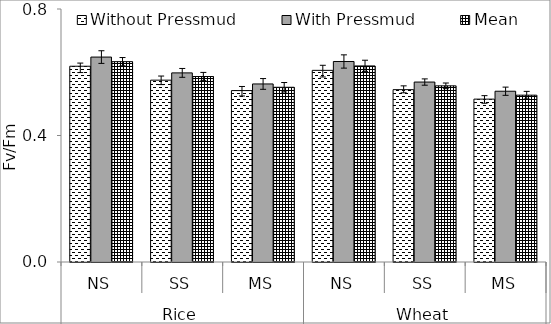
| Category | Without Pressmud | With Pressmud | Mean |
|---|---|---|---|
| 0 | 0.619 | 0.648 | 0.634 |
| 1 | 0.575 | 0.598 | 0.586 |
| 2 | 0.542 | 0.563 | 0.552 |
| 3 | 0.606 | 0.634 | 0.62 |
| 4 | 0.545 | 0.569 | 0.557 |
| 5 | 0.515 | 0.54 | 0.528 |